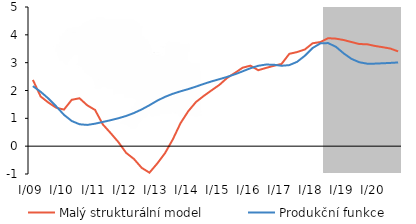
| Category | Malý strukturální model | Produkční funkce |
|---|---|---|
| I/09 | 2.381 | 2.158 |
| II | 1.784 | 1.954 |
| III | 1.565 | 1.712 |
| IV | 1.382 | 1.43 |
| I/10 | 1.314 | 1.126 |
| II | 1.665 | 0.904 |
| III | 1.721 | 0.787 |
| IV | 1.467 | 0.763 |
| I/11 | 1.301 | 0.807 |
| II | 0.781 | 0.869 |
| III | 0.472 | 0.933 |
| IV | 0.147 | 1.002 |
| I/12 | -0.24 | 1.085 |
| II | -0.459 | 1.191 |
| III | -0.779 | 1.32 |
| IV | -0.952 | 1.471 |
| I/13 | -0.624 | 1.634 |
| II | -0.253 | 1.772 |
| III | 0.24 | 1.882 |
| IV | 0.827 | 1.971 |
| I/14 | 1.258 | 2.051 |
| II | 1.59 | 2.142 |
| III | 1.807 | 2.238 |
| IV | 2.007 | 2.328 |
| I/15 | 2.202 | 2.406 |
| II | 2.453 | 2.489 |
| III | 2.632 | 2.582 |
| IV | 2.82 | 2.689 |
| I/16 | 2.892 | 2.801 |
| II | 2.729 | 2.888 |
| III | 2.811 | 2.932 |
| IV | 2.887 | 2.926 |
| I/17 | 2.954 | 2.888 |
| II | 3.317 | 2.912 |
| III | 3.381 | 3.03 |
| IV | 3.474 | 3.248 |
| I/18 | 3.697 | 3.527 |
| II | 3.741 | 3.693 |
| III | 3.879 | 3.704 |
| IV | 3.863 | 3.569 |
| I/19 | 3.813 | 3.333 |
| II | 3.742 | 3.137 |
| III | 3.669 | 3.016 |
| IV | 3.662 | 2.965 |
| I/20 | 3.602 | 2.965 |
| II | 3.557 | 2.978 |
| III | 3.507 | 2.991 |
| IV | 3.406 | 3.007 |